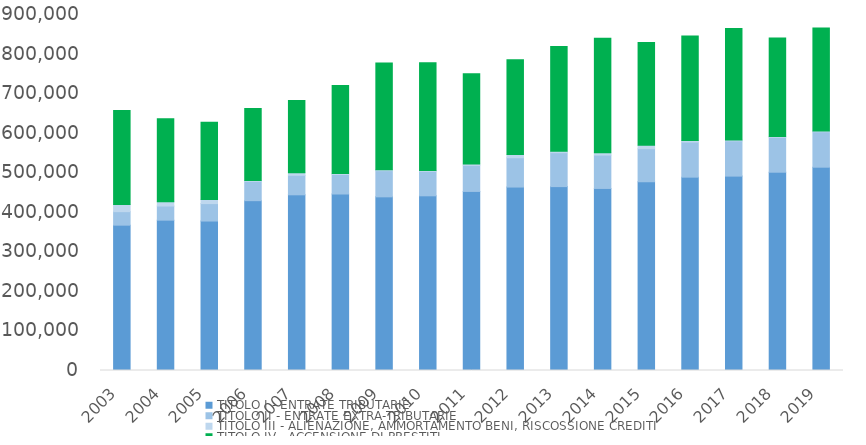
| Category | TITOLO I - ENTRATE TRIBUTARIE | TITOLO II - ENTRATE EXTRA-TRIBUTARIE | TITOLO III - ALIENAZIONE, AMMORTAMENTO BENI, RISCOSSIONE CREDITI | TITOLO IV - ACCENSIONE DI PRESTITI |
|---|---|---|---|---|
| 2003.0 | 367408 | 34150 | 17949 | 237530 |
| 2004.0 | 380062 | 35715 | 10992 | 209685 |
| 2005.0 | 377854 | 44105 | 10075 | 195380 |
| 2006.0 | 429363 | 48759 | 1921 | 182127 |
| 2007.0 | 444168 | 49382 | 6121 | 182747 |
| 2008.0 | 446165 | 49400 | 2182 | 222489 |
| 2009.0 | 439017 | 66150 | 2630 | 269718 |
| 2010.0 | 441614 | 61791 | 1921 | 272921 |
| 2011.0 | 452731.044 | 65697.905 | 3313.451 | 228422.129 |
| 2012.0 | 463768.62 | 74075.721 | 7946.719 | 239783.649 |
| 2013.0 | 464884.401 | 85665.455 | 3441.99 | 264846.999 |
| 2014.0 | 460253.424 | 84387.467 | 5545.741 | 289972.991 |
| 2015.0 | 477177.749 | 83602.841 | 8785.048 | 259542.417 |
| 2016.0 | 488794.687 | 88691.962 | 3828.358 | 264618.209 |
| 2017.0 | 491417.598 | 89081.525 | 2475.107 | 281609.658 |
| 2018.0 | 501300.352 | 88110.76 | 2200.483 | 249065.559 |
| 2019.0 | 513989.749 | 89462.788 | 2131.594 | 260408.77 |